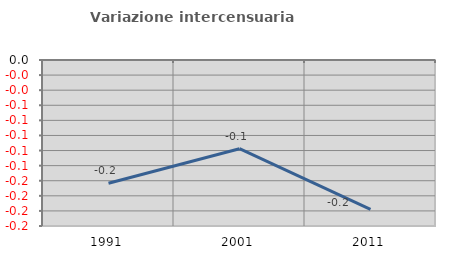
| Category | Variazione intercensuaria annua |
|---|---|
| 1991.0 | -0.163 |
| 2001.0 | -0.118 |
| 2011.0 | -0.198 |